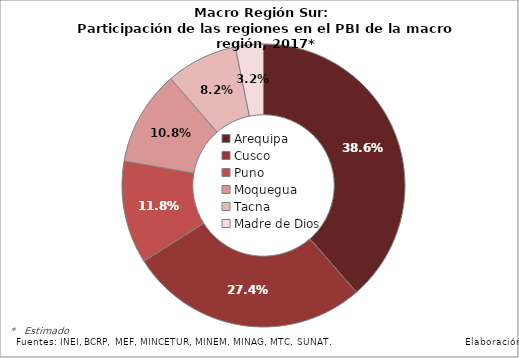
| Category | Series 0 |
|---|---|
| Arequipa | 0.386 |
| Cusco | 0.274 |
| Puno | 0.118 |
| Moquegua | 0.108 |
| Tacna | 0.082 |
| Madre de Dios | 0.032 |